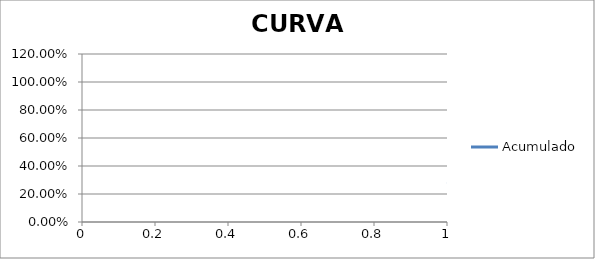
| Category | Acumulado |
|---|---|
| 0 | 0.272 |
| 1 | 0.526 |
| 2 | 0.736 |
| 3 | 0.89 |
| 4 | 0.974 |
| 5 | 0.988 |
| 6 | 1 |